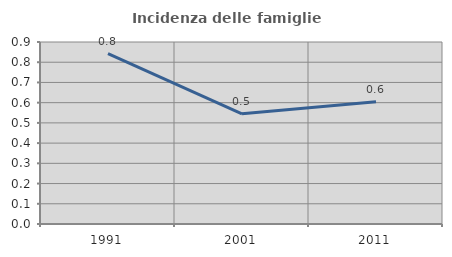
| Category | Incidenza delle famiglie numerose |
|---|---|
| 1991.0 | 0.843 |
| 2001.0 | 0.545 |
| 2011.0 | 0.604 |